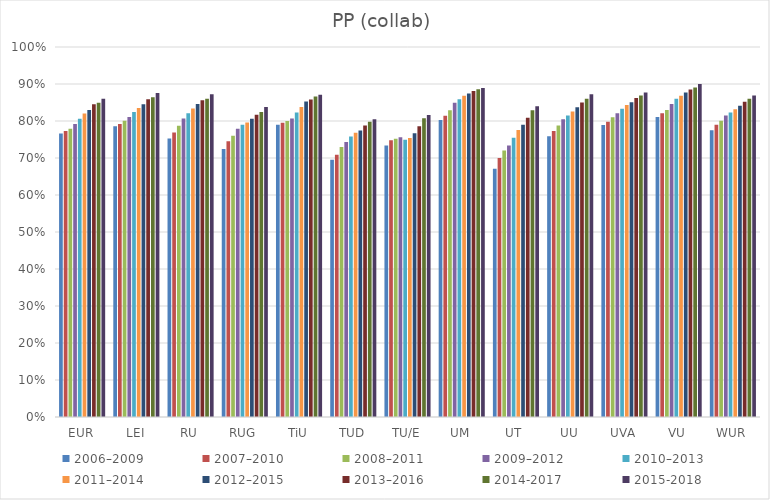
| Category | 2006–2009 | 2007–2010 | 2008–2011 | 2009–2012 | 2010–2013 | 2011–2014 | 2012–2015 | 2013–2016 | 2014-2017 | 2015-2018 |
|---|---|---|---|---|---|---|---|---|---|---|
| EUR | 76.6 | 77.3 | 77.9 | 79.2 | 80.6 | 82 | 83 | 84.5 | 84.952 | 86 |
| LEI | 78.6 | 79.2 | 80.1 | 81.1 | 82.4 | 83.5 | 84.5 | 85.9 | 86.442 | 87.6 |
| RU | 75.3 | 76.9 | 78.7 | 80.7 | 82.1 | 83.4 | 84.6 | 85.6 | 86.024 | 87.2 |
| RUG | 72.4 | 74.5 | 76 | 77.9 | 79 | 79.6 | 80.6 | 81.7 | 82.46 | 83.8 |
| TiU | 79 | 79.5 | 80 | 80.7 | 82.3 | 83.8 | 85.3 | 85.8 | 86.613 | 87.1 |
| TUD | 69.5 | 70.9 | 73 | 74.3 | 75.8 | 76.8 | 77.4 | 78.8 | 79.798 | 80.5 |
| TU/E | 73.4 | 74.8 | 75.2 | 75.6 | 74.9 | 75.4 | 76.7 | 78.6 | 80.755 | 81.6 |
| UM | 80.3 | 81.4 | 82.9 | 84.9 | 85.9 | 86.8 | 87.4 | 88.1 | 88.558 | 88.9 |
| UT | 67.1 | 70 | 72 | 73.4 | 75.5 | 77.6 | 79 | 80.9 | 82.907 | 84 |
| UU | 75.9 | 77.3 | 78.8 | 80.5 | 81.5 | 82.6 | 83.7 | 85 | 86.038 | 87.2 |
| UVA | 78.9 | 79.8 | 81 | 82.1 | 83.3 | 84.3 | 85.1 | 86.2 | 86.915 | 87.7 |
| VU | 81.1 | 82.1 | 83 | 84.6 | 86 | 86.8 | 87.7 | 88.5 | 89.059 | 90 |
| WUR | 77.5 | 79 | 80.1 | 81.5 | 82.3 | 83.2 | 84.1 | 85.2 | 86.018 | 86.9 |